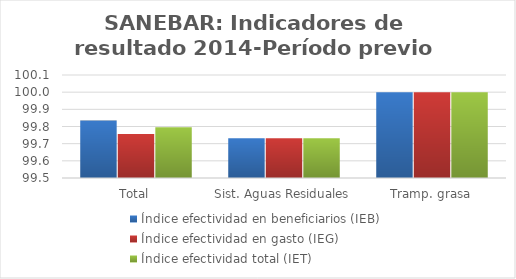
| Category | Índice efectividad en beneficiarios (IEB) | Índice efectividad en gasto (IEG)  | Índice efectividad total (IET) |
|---|---|---|---|
| Total | 99.835 | 99.756 | 99.796 |
| Sist. Aguas Residuales | 99.732 | 99.732 | 99.732 |
| Tramp. grasa | 100 | 100 | 100 |